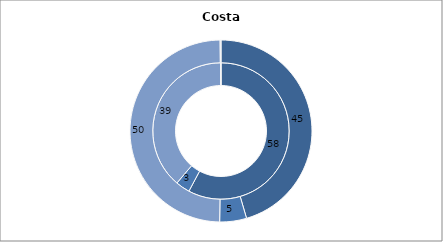
| Category | Immigrants | Native population |
|---|---|---|
| Employed | 57.81 | 45.47 |
| Unemployed | 3.39 | 4.77 |
| Non-active | 38.74 | 49.61 |
| Other | 0.07 | 0.15 |